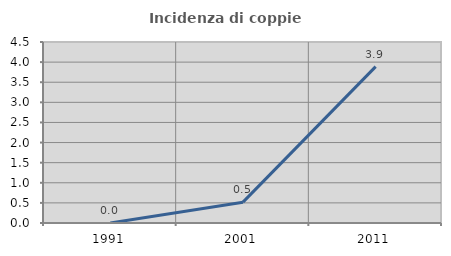
| Category | Incidenza di coppie miste |
|---|---|
| 1991.0 | 0 |
| 2001.0 | 0.518 |
| 2011.0 | 3.889 |